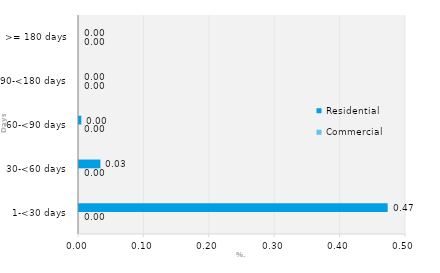
| Category | Commercial | Residential |
|---|---|---|
| 1-<30 days | 0 | 0.472 |
| 30-<60 days | 0 | 0.033 |
| 60-<90 days | 0 | 0.004 |
| 90-<180 days | 0 | 0 |
| >= 180 days | 0 | 0 |